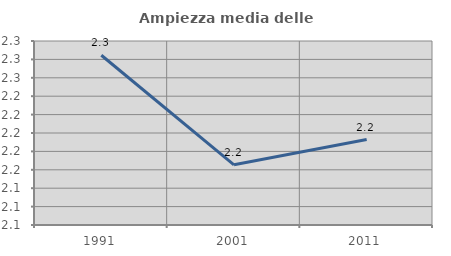
| Category | Ampiezza media delle famiglie |
|---|---|
| 1991.0 | 2.284 |
| 2001.0 | 2.165 |
| 2011.0 | 2.193 |